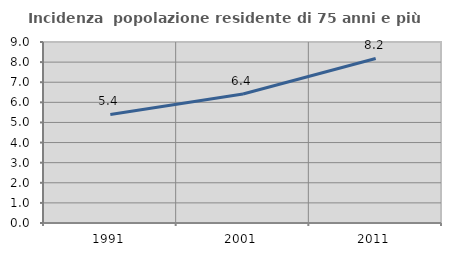
| Category | Incidenza  popolazione residente di 75 anni e più |
|---|---|
| 1991.0 | 5.396 |
| 2001.0 | 6.418 |
| 2011.0 | 8.18 |